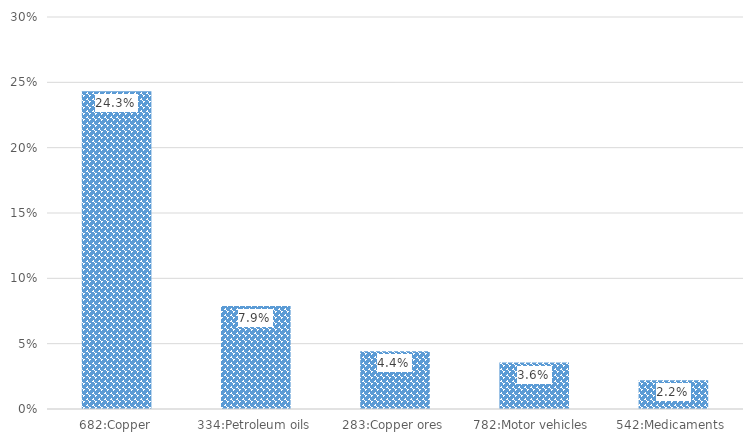
| Category | %Share |
|---|---|
| 682:Copper | 0.243 |
| 334:Petroleum oils | 0.079 |
| 283:Copper ores  | 0.044 |
| 782:Motor vehicles  | 0.036 |
| 542:Medicaments  | 0.022 |